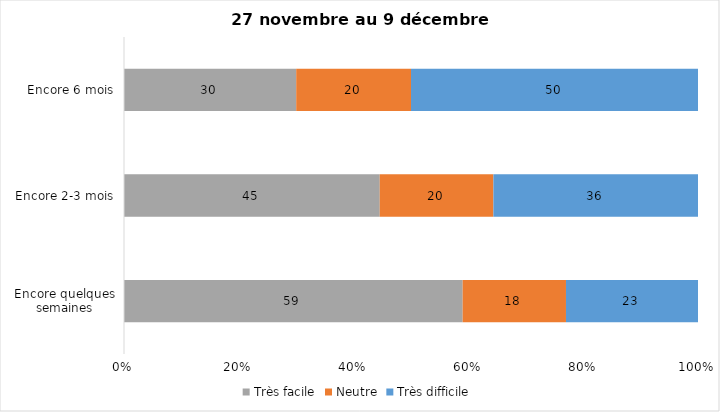
| Category | Très facile | Neutre | Très difficile |
|---|---|---|---|
| Encore quelques semaines | 59 | 18 | 23 |
| Encore 2-3 mois | 45 | 20 | 36 |
| Encore 6 mois | 30 | 20 | 50 |